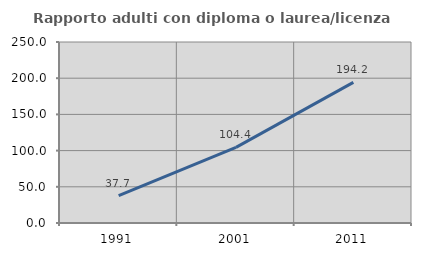
| Category | Rapporto adulti con diploma o laurea/licenza media  |
|---|---|
| 1991.0 | 37.705 |
| 2001.0 | 104.444 |
| 2011.0 | 194.186 |